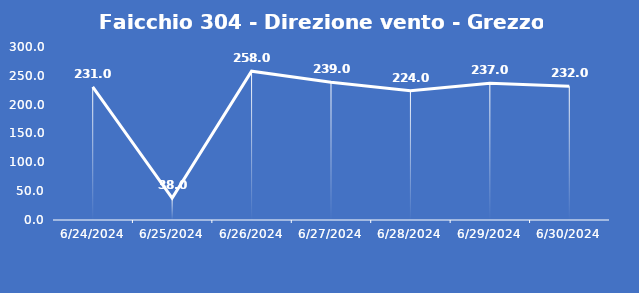
| Category | Faicchio 304 - Direzione vento - Grezzo (°N) |
|---|---|
| 6/24/24 | 231 |
| 6/25/24 | 38 |
| 6/26/24 | 258 |
| 6/27/24 | 239 |
| 6/28/24 | 224 |
| 6/29/24 | 237 |
| 6/30/24 | 232 |